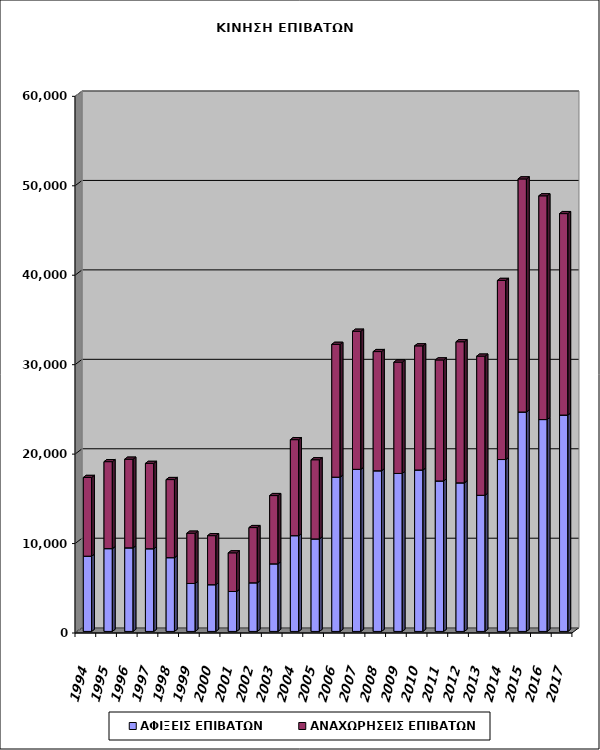
| Category | ΑΦΙΞΕΙΣ ΕΠΙΒΑΤΩΝ | ΑΝΑΧΩΡΗΣΕΙΣ ΕΠΙΒΑΤΩΝ |
|---|---|---|
| 1994.0 | 8411 | 8800 |
| 1995.0 | 9256 | 9723 |
| 1996.0 | 9344 | 9907 |
| 1997.0 | 9243 | 9541 |
| 1998.0 | 8247 | 8729 |
| 1999.0 | 5360 | 5618 |
| 2000.0 | 5222 | 5484 |
| 2001.0 | 4464 | 4318 |
| 2002.0 | 5436 | 6173 |
| 2003.0 | 7557 | 7629 |
| 2004.0 | 10706 | 10733 |
| 2005.0 | 10340 | 8853 |
| 2006.0 | 17247 | 14845 |
| 2007.0 | 18121 | 15436 |
| 2008.0 | 17959 | 13326 |
| 2009.0 | 17659 | 12447 |
| 2010.0 | 18049 | 13875 |
| 2011.0 | 16822 | 13529 |
| 2012.0 | 16608 | 15777 |
| 2013.0 | 15220 | 15554 |
| 2014.0 | 19217 | 20021 |
| 2015.0 | 24531 | 26058 |
| 2016.0 | 23685 | 25015 |
| 2017.0 | 24189 | 22521 |